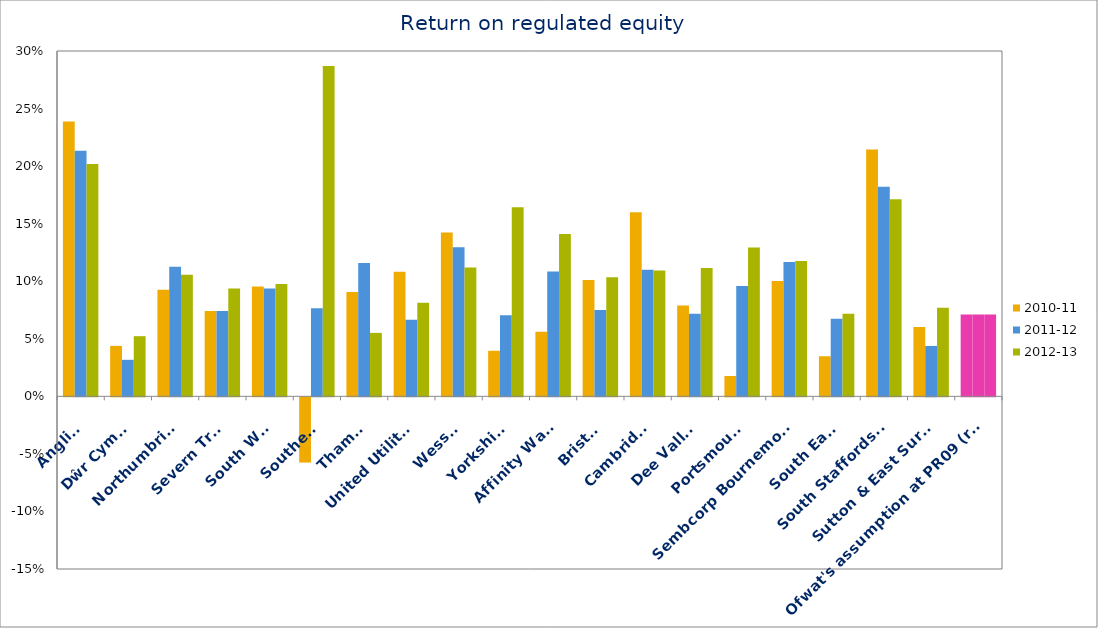
| Category | 2010-11 | 2011-12 | 2012-13 |
|---|---|---|---|
| Anglian | 0.239 | 0.213 | 0.202 |
| Dŵr Cymru | 0.044 | 0.032 | 0.052 |
| Northumbrian | 0.093 | 0.113 | 0.106 |
| Severn Trent | 0.074 | 0.074 | 0.094 |
| South West | 0.095 | 0.094 | 0.098 |
| Southern | -0.057 | 0.077 | 0.287 |
| Thames | 0.091 | 0.116 | 0.055 |
| United Utilities | 0.108 | 0.066 | 0.081 |
| Wessex | 0.142 | 0.129 | 0.112 |
| Yorkshire | 0.04 | 0.07 | 0.164 |
| Affinity Water | 0.056 | 0.108 | 0.141 |
| Bristol | 0.101 | 0.075 | 0.103 |
| Cambridge | 0.16 | 0.11 | 0.109 |
| Dee Valley | 0.079 | 0.072 | 0.111 |
| Portsmouth | 0.018 | 0.096 | 0.129 |
| Sembcorp Bournemouth | 0.1 | 0.117 | 0.118 |
| South East | 0.035 | 0.067 | 0.072 |
| South Staffordshire | 0.214 | 0.182 | 0.171 |
| Sutton & East Surrey | 0.06 | 0.044 | 0.077 |
| Ofwat's assumption at PR09 (real)3 | 0.071 | 0.071 | 0.071 |